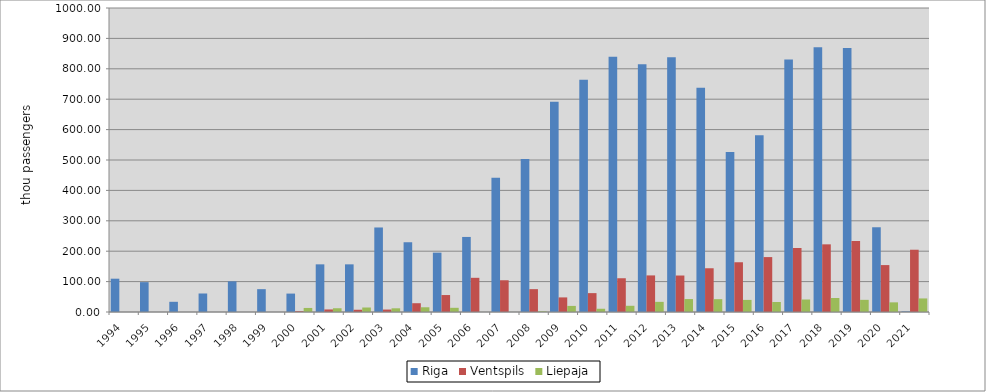
| Category | Riga | Ventspils | Liepaja |
|---|---|---|---|
| 1994.0 | 109.57 | 0 | 0 |
| 1995.0 | 98.19 | 0 | 0 |
| 1996.0 | 33.55 | 0 | 0 |
| 1997.0 | 60.88 | 0 | 0 |
| 1998.0 | 100.833 | 0 | 0 |
| 1999.0 | 75.147 | 0 | 0 |
| 2000.0 | 60.586 | 2.681 | 13.311 |
| 2001.0 | 156.77 | 8.37 | 12.356 |
| 2002.0 | 156.77 | 7.404 | 14.786 |
| 2003.0 | 278.028 | 8.032 | 12.162 |
| 2004.0 | 229.474 | 28.887 | 15.53 |
| 2005.0 | 195.195 | 55.788 | 13.812 |
| 2006.0 | 246.885 | 112.46 | 0.153 |
| 2007.0 | 441.914 | 104.422 | 0.116 |
| 2008.0 | 503.594 | 75.174 | 2.115 |
| 2009.0 | 691.236 | 48.012 | 20.041 |
| 2010.0 | 764.001 | 62.109 | 10.674 |
| 2011.0 | 839.712 | 111.019 | 20.432 |
| 2012.0 | 815.026 | 120.344 | 33.361 |
| 2013.0 | 837.665 | 120.014 | 42.607 |
| 2014.0 | 737.865 | 143.891 | 42.203 |
| 2015.0 | 526.243 | 163.666 | 39.782 |
| 2016.0 | 581.577 | 180.632 | 32.992 |
| 2017.0 | 830.38 | 210.532 | 41.111 |
| 2018.0 | 870.825 | 222.562 | 46.113 |
| 2019.0 | 868.656 | 233.537 | 39.987 |
| 2020.0 | 278.759 | 154.347 | 31.731 |
| 2021.0 | 2.005 | 204.843 | 44.612 |